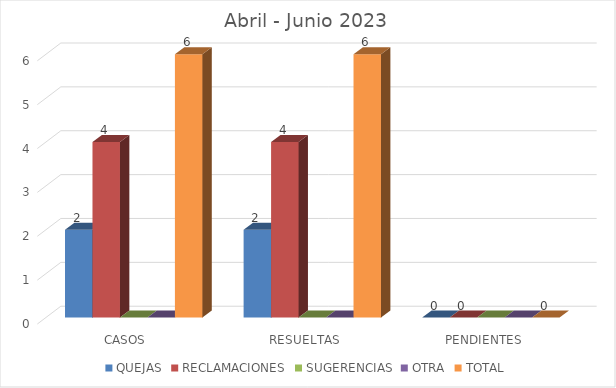
| Category | QUEJAS | RECLAMACIONES | SUGERENCIAS | OTRA | TOTAL |
|---|---|---|---|---|---|
| CASOS | 2 | 4 | 0 | 0 | 6 |
| RESUELTAS | 2 | 4 | 0 | 0 | 6 |
| PENDIENTES | 0 | 0 | 0 | 0 | 0 |